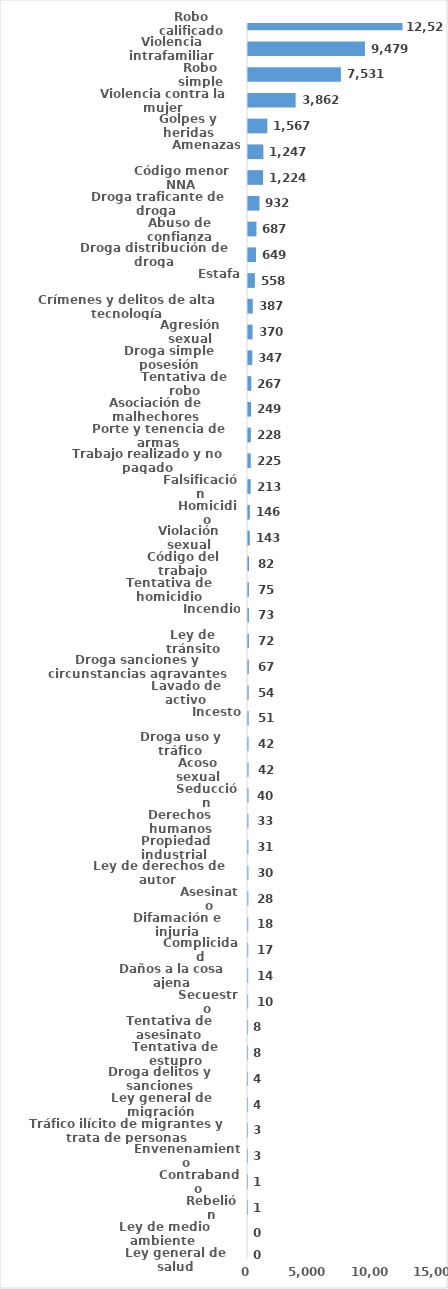
| Category | Series 0 |
|---|---|
| Robo calificado | 12527 |
| Violencia intrafamiliar | 9479 |
| Robo simple | 7531 |
| Violencia contra la mujer | 3862 |
| Golpes y heridas | 1567 |
| Amenazas | 1247 |
| Código menor NNA | 1224 |
| Droga traficante de droga  | 932 |
| Abuso de confianza | 687 |
| Droga distribución de droga | 649 |
| Estafa | 558 |
| Crímenes y delitos de alta tecnología | 387 |
| Agresión sexual | 370 |
| Droga simple posesión | 347 |
| Tentativa de robo | 267 |
| Asociación de malhechores | 249 |
| Porte y tenencia de armas | 228 |
| Trabajo realizado y no pagado | 225 |
| Falsificación | 213 |
| Homicidio | 146 |
| Violación sexual | 143 |
| Código del trabajo | 82 |
| Tentativa de homicidio | 75 |
| Incendio | 73 |
| Ley de tránsito | 72 |
| Droga sanciones y circunstancias agravantes | 67 |
| Lavado de activo | 54 |
| Incesto | 51 |
| Droga uso y tráfico | 42 |
| Acoso sexual | 42 |
| Seducción | 40 |
| Derechos humanos | 33 |
| Propiedad industrial  | 31 |
| Ley de derechos de autor  | 30 |
| Asesinato | 28 |
| Difamación e injuria | 18 |
| Complicidad | 17 |
| Daños a la cosa ajena | 14 |
| Secuestro | 10 |
| Tentativa de asesinato | 8 |
| Tentativa de estupro | 8 |
| Droga delitos y sanciones | 4 |
| Ley general de migración | 4 |
| Tráfico ilícito de migrantes y trata de personas | 3 |
| Envenenamiento | 3 |
| Contrabando | 1 |
| Rebelión | 1 |
| Ley de medio ambiente  | 0 |
| Ley general de salud | 0 |